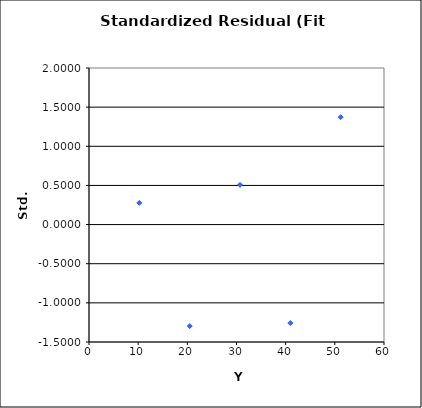
| Category | StdResidual |
|---|---|
| 10.2364 | 0.277 |
| 20.4727 | -1.297 |
| 30.7091 | 0.508 |
| 40.9455 | -1.258 |
| 51.1818 | 1.372 |